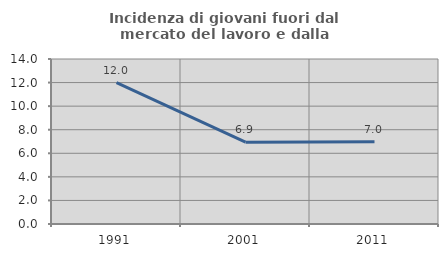
| Category | Incidenza di giovani fuori dal mercato del lavoro e dalla formazione  |
|---|---|
| 1991.0 | 12 |
| 2001.0 | 6.944 |
| 2011.0 | 6.977 |